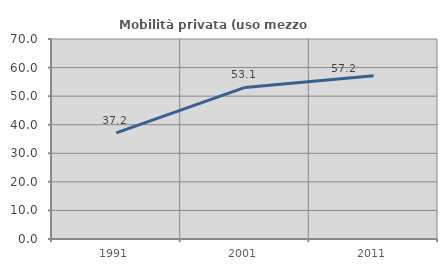
| Category | Mobilità privata (uso mezzo privato) |
|---|---|
| 1991.0 | 37.152 |
| 2001.0 | 53.053 |
| 2011.0 | 57.151 |